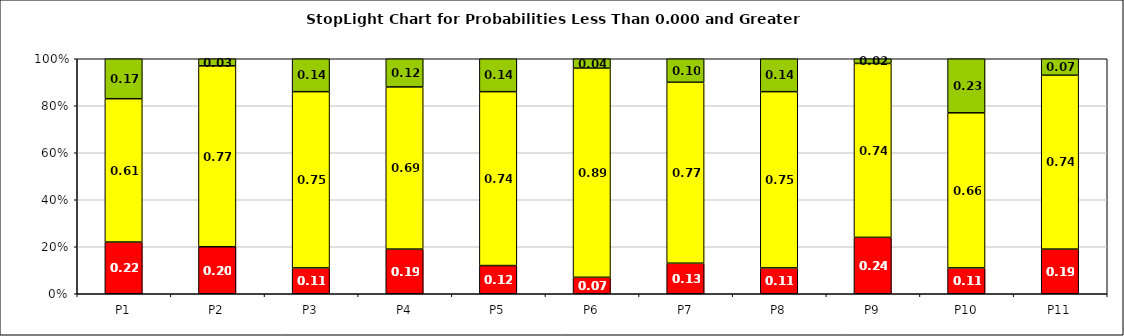
| Category | Series 0 | Series 1 | Series 2 |
|---|---|---|---|
| P1 | 0.22 | 0.61 | 0.17 |
| P2 | 0.2 | 0.77 | 0.03 |
| P3 | 0.11 | 0.75 | 0.14 |
| P4 | 0.19 | 0.69 | 0.12 |
| P5 | 0.12 | 0.74 | 0.14 |
| P6 | 0.07 | 0.89 | 0.04 |
| P7 | 0.13 | 0.77 | 0.1 |
| P8 | 0.11 | 0.75 | 0.14 |
| P9 | 0.24 | 0.74 | 0.02 |
| P10 | 0.11 | 0.66 | 0.23 |
| P11 | 0.19 | 0.74 | 0.07 |